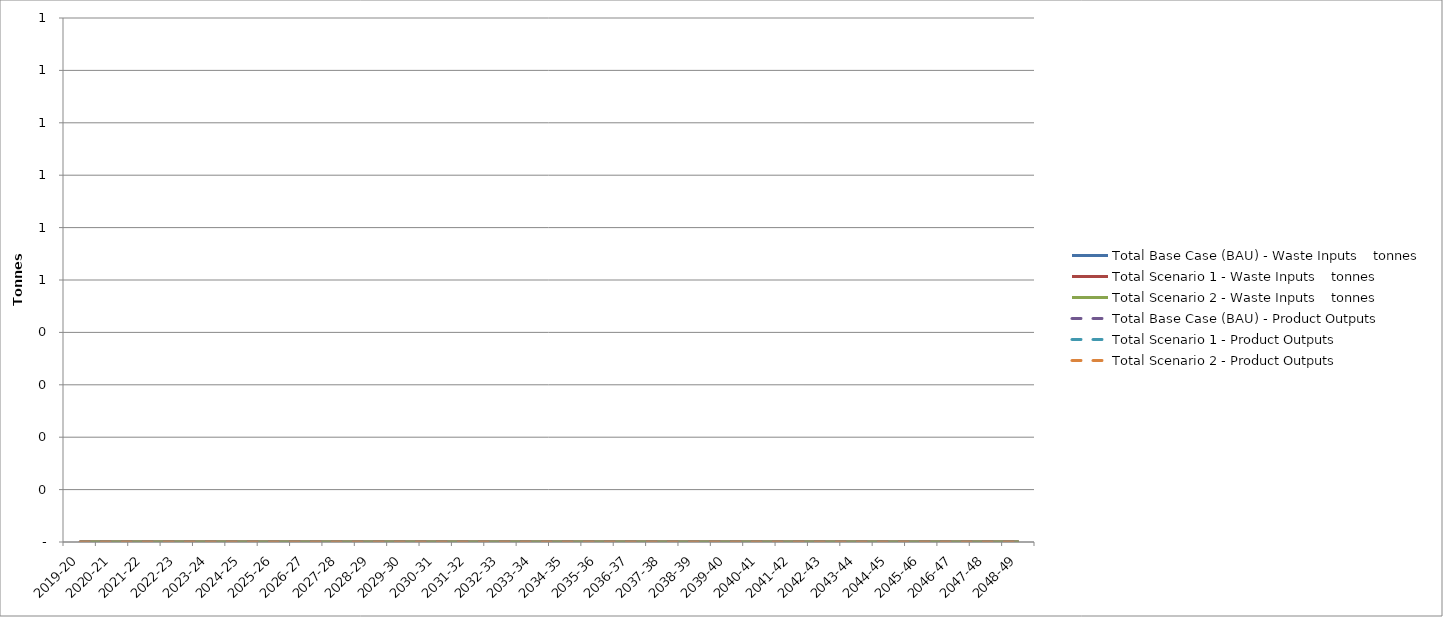
| Category | Total Base Case (BAU) - Waste Inputs | Total Scenario 1 - Waste Inputs | Total Scenario 2 - Waste Inputs | Total Base Case (BAU) - Product Outputs | Total Scenario 1 - Product Outputs | Total Scenario 2 - Product Outputs |
|---|---|---|---|---|---|---|
| 2019-20 | 0 | 0 | 0 | 0 | 0 | 0 |
| 2020-21 | 0 | 0 | 0 | 0 | 0 | 0 |
| 2021-22 | 0 | 0 | 0 | 0 | 0 | 0 |
| 2022-23 | 0 | 0 | 0 | 0 | 0 | 0 |
| 2023-24 | 0 | 0 | 0 | 0 | 0 | 0 |
| 2024-25 | 0 | 0 | 0 | 0 | 0 | 0 |
| 2025-26 | 0 | 0 | 0 | 0 | 0 | 0 |
| 2026-27 | 0 | 0 | 0 | 0 | 0 | 0 |
| 2027-28 | 0 | 0 | 0 | 0 | 0 | 0 |
| 2028-29 | 0 | 0 | 0 | 0 | 0 | 0 |
| 2029-30 | 0 | 0 | 0 | 0 | 0 | 0 |
| 2030-31 | 0 | 0 | 0 | 0 | 0 | 0 |
| 2031-32 | 0 | 0 | 0 | 0 | 0 | 0 |
| 2032-33 | 0 | 0 | 0 | 0 | 0 | 0 |
| 2033-34 | 0 | 0 | 0 | 0 | 0 | 0 |
| 2034-35 | 0 | 0 | 0 | 0 | 0 | 0 |
| 2035-36 | 0 | 0 | 0 | 0 | 0 | 0 |
| 2036-37 | 0 | 0 | 0 | 0 | 0 | 0 |
| 2037-38 | 0 | 0 | 0 | 0 | 0 | 0 |
| 2038-39 | 0 | 0 | 0 | 0 | 0 | 0 |
| 2039-40 | 0 | 0 | 0 | 0 | 0 | 0 |
| 2040-41 | 0 | 0 | 0 | 0 | 0 | 0 |
| 2041-42 | 0 | 0 | 0 | 0 | 0 | 0 |
| 2042-43 | 0 | 0 | 0 | 0 | 0 | 0 |
| 2043-44 | 0 | 0 | 0 | 0 | 0 | 0 |
| 2044-45 | 0 | 0 | 0 | 0 | 0 | 0 |
| 2045-46 | 0 | 0 | 0 | 0 | 0 | 0 |
| 2046-47 | 0 | 0 | 0 | 0 | 0 | 0 |
| 2047-48 | 0 | 0 | 0 | 0 | 0 | 0 |
| 2048-49 | 0 | 0 | 0 | 0 | 0 | 0 |